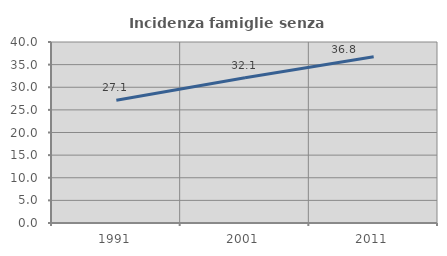
| Category | Incidenza famiglie senza nuclei |
|---|---|
| 1991.0 | 27.122 |
| 2001.0 | 32.105 |
| 2011.0 | 36.757 |